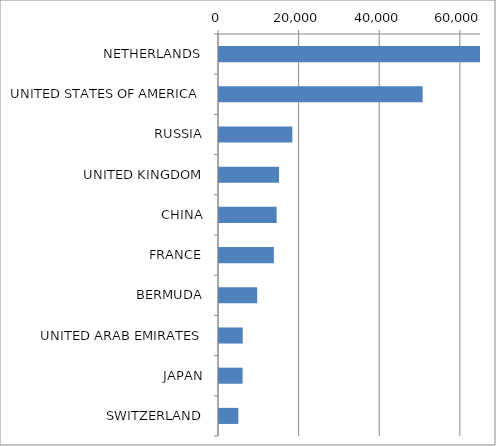
| Category | Series 0 |
|---|---|
| NETHERLANDS | 65108.308 |
| UNITED STATES OF AMERICA | 50526.021 |
| RUSSIA | 18195.966 |
| UNITED KINGDOM | 14901.171 |
| CHINA | 14302.677 |
| FRANCE | 13614.04 |
| BERMUDA | 9479.351 |
| UNITED ARAB EMIRATES | 5885.276 |
| JAPAN | 5858.072 |
| SWITZERLAND | 4801.038 |